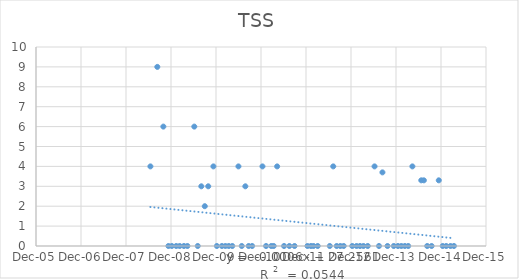
| Category | Series 0 |
|---|---|
| 39618.0 | 4 |
| 39674.0 | 9 |
| 39723.0 | 6 |
| 39764.0 | 0 |
| 39792.0 | 0 |
| 39827.0 | 0 |
| 39856.0 | 0 |
| 39890.0 | 0 |
| 39918.0 | 0 |
| 39974.0 | 6 |
| 40002.0 | 0 |
| 40031.0 | 3 |
| 40059.0 | 2 |
| 40087.0 | 3 |
| 40129.0 | 4 |
| 40157.0 | 0 |
| 40198.0 | 0 |
| 40226.0 | 0 |
| 40282.0 | 0 |
| 40254.0 | 0 |
| 40332.0 | 4 |
| 40359.0 | 0 |
| 40388.0 | 3 |
| 40415.0 | 0 |
| 40443.0 | 0 |
| 40527.0 | 4 |
| 40556.0 | 0 |
| 40598.0 | 0 |
| 40618.0 | 0 |
| 40646.0 | 4 |
| 40702.0 | 0 |
| 40745.0 | 0 |
| 40787.0 | 0 |
| 40892.0 | 0 |
| 40920.0 | 0 |
| 40941.0 | 0 |
| 40975.0 | 0 |
| 41073.0 | 0 |
| 41101.0 | 4 |
| 41129.0 | 0 |
| 41158.0 | 0 |
| 41186.0 | 0 |
| 41255.0 | 0 |
| 41290.0 | 0 |
| 41318.0 | 0 |
| 41346.0 | 0 |
| 41381.0 | 0 |
| 41436.0 | 4 |
| 41472.0 | 0 |
| 41500.0 | 3.7 |
| 41541.0 | 0 |
| 41592.0 | 0 |
| 41626.0 | 0 |
| 41653.0 | 0 |
| 41682.0 | 0 |
| 41709.0 | 0 |
| 41743.0 | 4 |
| 41815.0 | 3.3 |
| 41836.0 | 3.3 |
| 41863.0 | 0 |
| 41899.0 | 0 |
| 41957.0 | 3.3 |
| 41989.0 | 0 |
| 42017.0 | 0 |
| 42052.0 | 0 |
| 42080.0 | 0 |